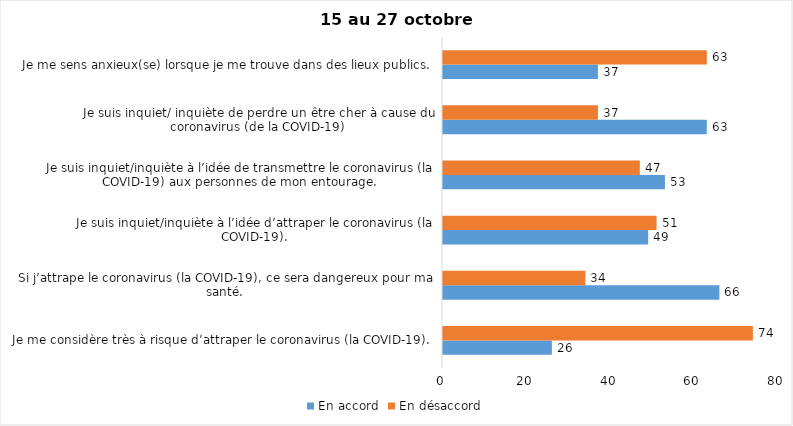
| Category | En accord | En désaccord |
|---|---|---|
| Je me considère très à risque d’attraper le coronavirus (la COVID-19). | 26 | 74 |
| Si j’attrape le coronavirus (la COVID-19), ce sera dangereux pour ma santé. | 66 | 34 |
| Je suis inquiet/inquiète à l’idée d’attraper le coronavirus (la COVID-19). | 49 | 51 |
| Je suis inquiet/inquiète à l’idée de transmettre le coronavirus (la COVID-19) aux personnes de mon entourage. | 53 | 47 |
| Je suis inquiet/ inquiète de perdre un être cher à cause du coronavirus (de la COVID-19) | 63 | 37 |
| Je me sens anxieux(se) lorsque je me trouve dans des lieux publics. | 37 | 63 |